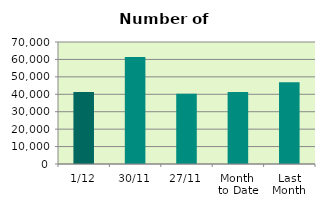
| Category | Series 0 |
|---|---|
| 1/12 | 41270 |
| 30/11 | 61436 |
| 27/11 | 40248 |
| Month 
to Date | 41270 |
| Last
Month | 46860.952 |